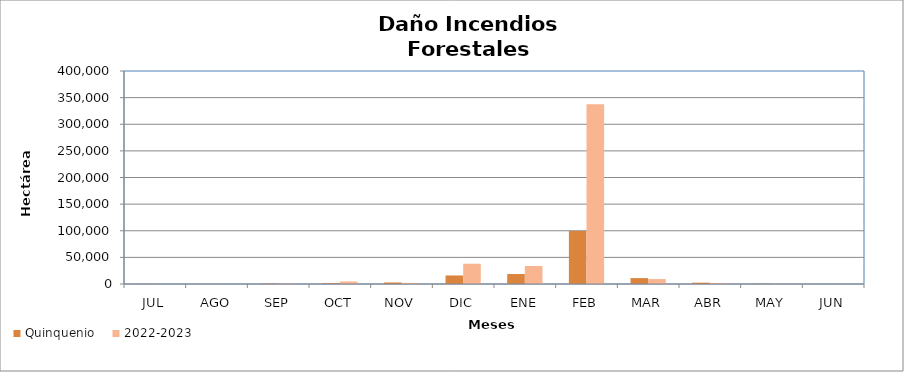
| Category | Quinquenio | 2022-2023 |
|---|---|---|
| JUL | 442.703 | 40.75 |
| AGO | 129.77 | 21.22 |
| SEP | 831.281 | 917.64 |
| OCT | 1505.968 | 4725.42 |
| NOV | 2877.056 | 2081.72 |
| DIC | 16025.772 | 38023.02 |
| ENE | 18726.724 | 33879.62 |
| FEB | 99685.714 | 337498.53 |
| MAR | 11090.582 | 9337.69 |
| ABR | 2520.71 | 2020.59 |
| MAY | 587.846 | 460.16 |
| JUN | 59.241 | 96.66 |